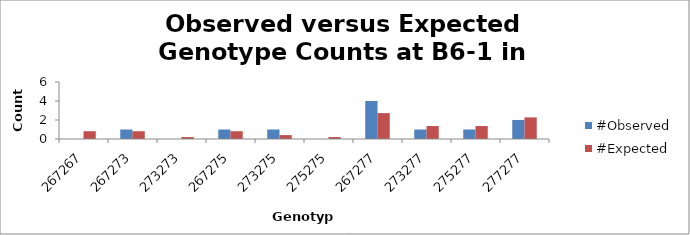
| Category | #Observed | #Expected |
|---|---|---|
| 267267.0 | 0 | 0.818 |
| 267273.0 | 1 | 0.818 |
| 273273.0 | 0 | 0.205 |
| 267275.0 | 1 | 0.818 |
| 273275.0 | 1 | 0.409 |
| 275275.0 | 0 | 0.205 |
| 267277.0 | 4 | 2.727 |
| 273277.0 | 1 | 1.364 |
| 275277.0 | 1 | 1.364 |
| 277277.0 | 2 | 2.273 |